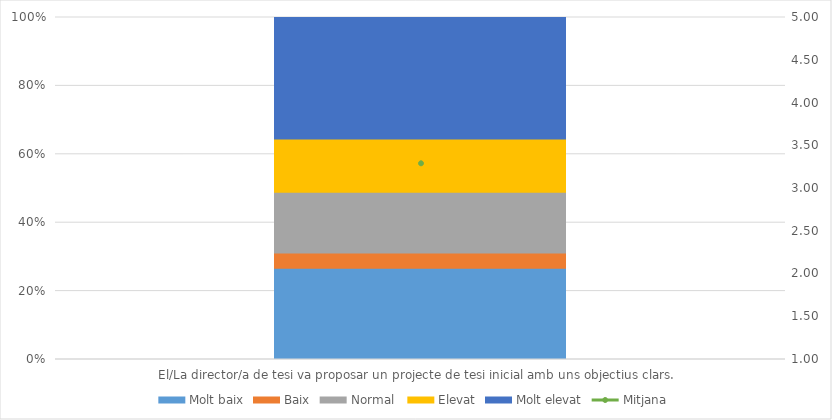
| Category | Molt baix | Baix | Normal  | Elevat | Molt elevat |
|---|---|---|---|---|---|
| El/La director/a de tesi va proposar un projecte de tesi inicial amb uns objectius clars.  | 12 | 2 | 8 | 7 | 16 |